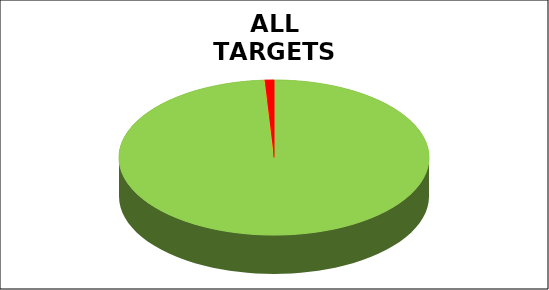
| Category | Series 0 |
|---|---|
| Green | 0.99 |
| Amber | 0 |
| Red | 0.01 |